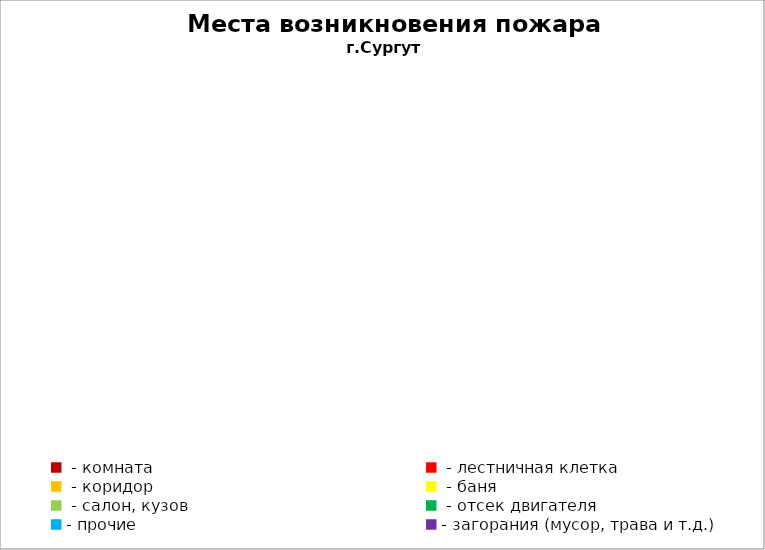
| Category | Места возникновения пожара |
|---|---|
|  - комната | 67 |
|  - лестничная клетка | 14 |
|  - коридор | 11 |
|  - баня | 38 |
|  - салон, кузов | 25 |
|  - отсек двигателя | 42 |
| - прочие | 96 |
| - загорания (мусор, трава и т.д.)  | 161 |